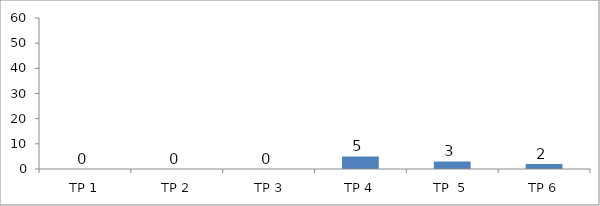
| Category | BIL. MURID |
|---|---|
| TP 1 | 0 |
| TP 2 | 0 |
|  TP 3 | 0 |
| TP 4 | 5 |
| TP  5 | 3 |
| TP 6 | 2 |